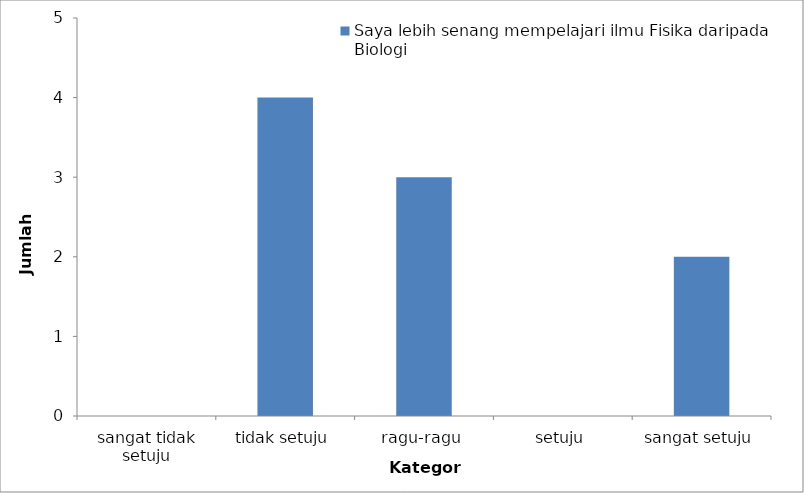
| Category | Saya lebih senang mempelajari ilmu Fisika daripada Biologi |
|---|---|
| sangat tidak setuju | 0 |
| tidak setuju | 4 |
| ragu-ragu | 3 |
| setuju | 0 |
| sangat setuju | 2 |